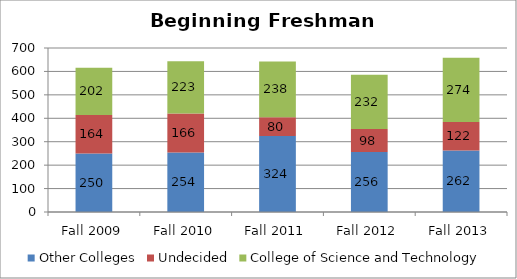
| Category | Other Colleges | Undecided | College of Science and Technology |
|---|---|---|---|
| Fall 2009 | 250 | 164 | 202 |
| Fall 2010 | 254 | 166 | 223 |
| Fall 2011 | 324 | 80 | 238 |
| Fall 2012 | 256 | 98 | 232 |
| Fall 2013 | 262 | 122 | 274 |